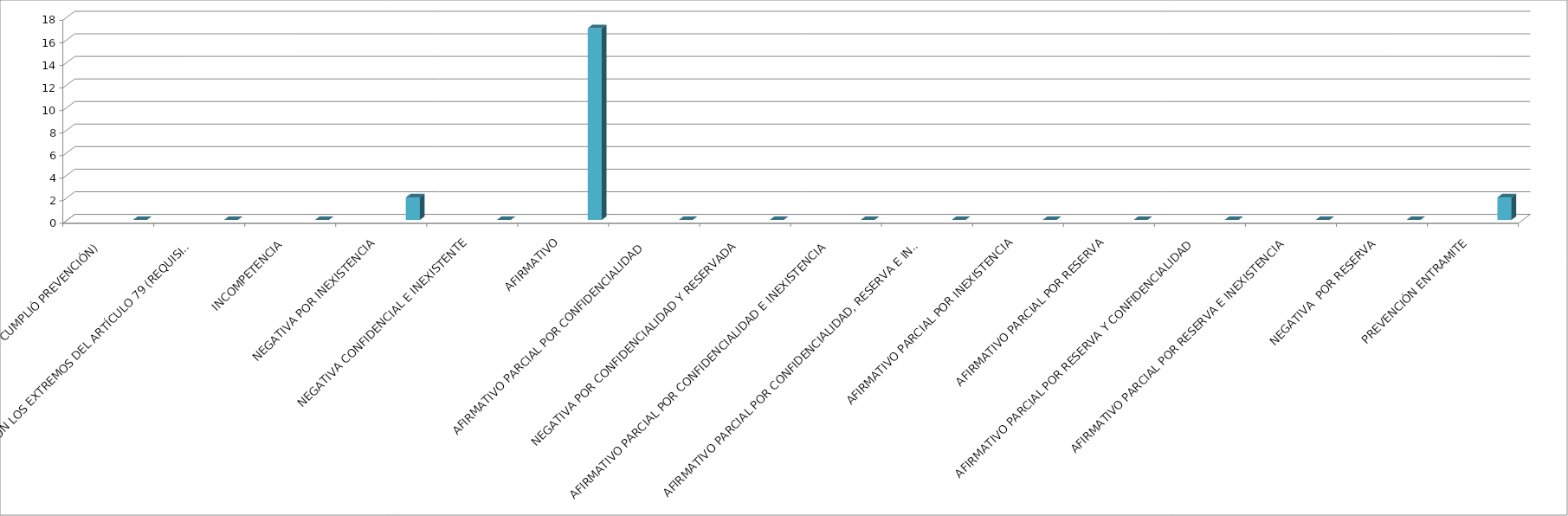
| Category | Series 0 | Series 1 | Series 2 | Series 3 | Series 4 |
|---|---|---|---|---|---|
| SE TIENE POR NO PRESENTADA ( NO CUMPLIÓ PREVENCIÓN) |  |  |  |  | 0 |
| NO CUMPLIO CON LOS EXTREMOS DEL ARTÍCULO 79 (REQUISITOS) |  |  |  |  | 0 |
| INCOMPETENCIA  |  |  |  |  | 0 |
| NEGATIVA POR INEXISTENCIA |  |  |  |  | 2 |
| NEGATIVA CONFIDENCIAL E INEXISTENTE |  |  |  |  | 0 |
| AFIRMATIVO |  |  |  |  | 17 |
| AFIRMATIVO PARCIAL POR CONFIDENCIALIDAD  |  |  |  |  | 0 |
| NEGATIVA POR CONFIDENCIALIDAD Y RESERVADA |  |  |  |  | 0 |
| AFIRMATIVO PARCIAL POR CONFIDENCIALIDAD E INEXISTENCIA |  |  |  |  | 0 |
| AFIRMATIVO PARCIAL POR CONFIDENCIALIDAD, RESERVA E INEXISTENCIA |  |  |  |  | 0 |
| AFIRMATIVO PARCIAL POR INEXISTENCIA |  |  |  |  | 0 |
| AFIRMATIVO PARCIAL POR RESERVA |  |  |  |  | 0 |
| AFIRMATIVO PARCIAL POR RESERVA Y CONFIDENCIALIDAD |  |  |  |  | 0 |
| AFIRMATIVO PARCIAL POR RESERVA E INEXISTENCIA |  |  |  |  | 0 |
| NEGATIVA  POR RESERVA |  |  |  |  | 0 |
| PREVENCIÓN ENTRAMITE |  |  |  |  | 2 |